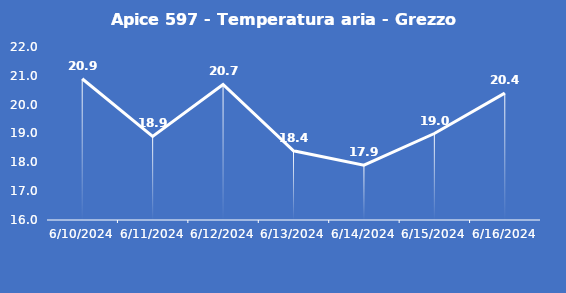
| Category | Apice 597 - Temperatura aria - Grezzo (°C) |
|---|---|
| 6/10/24 | 20.9 |
| 6/11/24 | 18.9 |
| 6/12/24 | 20.7 |
| 6/13/24 | 18.4 |
| 6/14/24 | 17.9 |
| 6/15/24 | 19 |
| 6/16/24 | 20.4 |